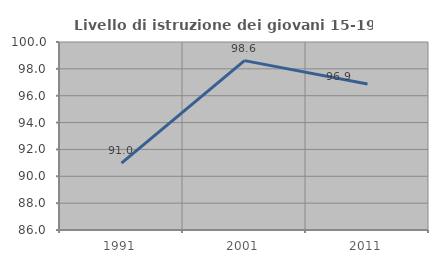
| Category | Livello di istruzione dei giovani 15-19 anni |
|---|---|
| 1991.0 | 90.984 |
| 2001.0 | 98.611 |
| 2011.0 | 96.875 |